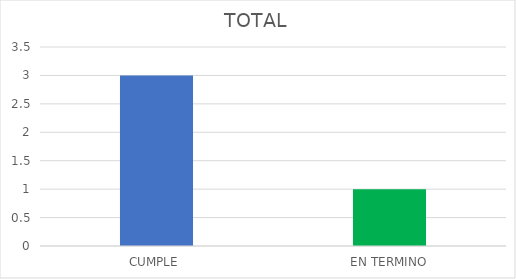
| Category | TOTAL |
|---|---|
| CUMPLE | 3 |
| EN TERMINO | 1 |